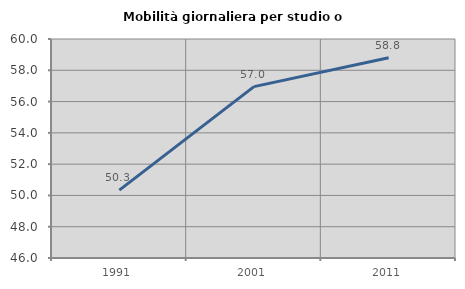
| Category | Mobilità giornaliera per studio o lavoro |
|---|---|
| 1991.0 | 50.338 |
| 2001.0 | 56.955 |
| 2011.0 | 58.807 |